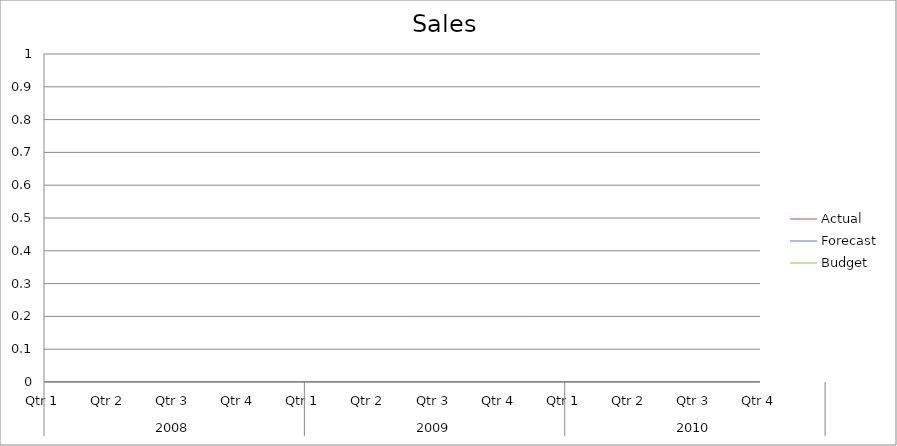
| Category | Budget | Forecast | Actual |
|---|---|---|---|
| 0 | 3240 | 1890 | 1370 |
| 1 | 510 | 910 | 1300 |
| 2 | 2180 | 2190 | 590 |
| 3 | 880 | 2570 | 1730 |
| 4 | 3260 | 1750 | 1100 |
| 5 | 1850 | 1430 | 3260 |
| 6 | 1900 | 890 | 1120 |
| 7 | 3030 | 1000 | 2090 |
| 8 | 630 | 2530 | 2610 |
| 9 | 3190 | 3200 | 3210 |
| 10 | 1990 | 2510 | 1120 |
| 11 | 1140 | 980 | 2020 |